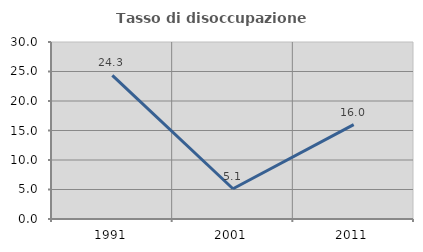
| Category | Tasso di disoccupazione giovanile  |
|---|---|
| 1991.0 | 24.348 |
| 2001.0 | 5.128 |
| 2011.0 | 16 |